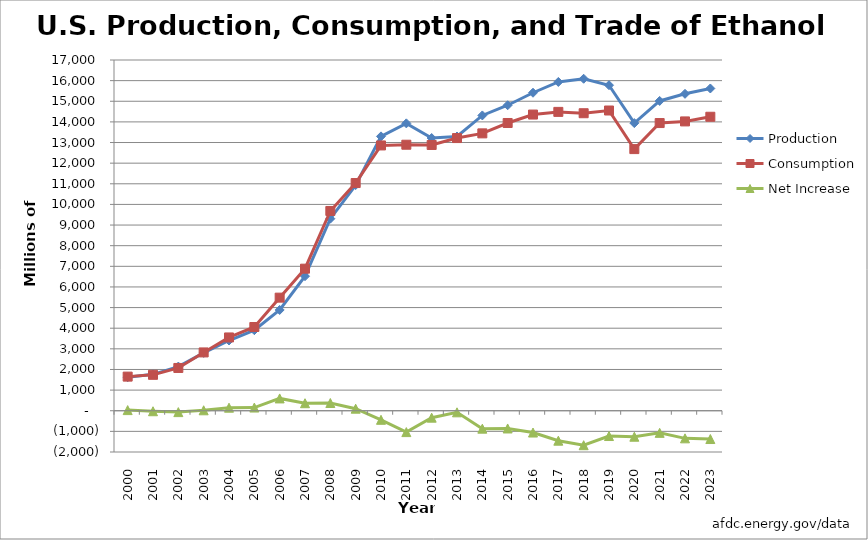
| Category | Production  | Consumption | Net Increase |
|---|---|---|---|
| 2000.0 | 1622.334 | 1653.414 | 31.08 |
| 2001.0 | 1765.176 | 1740.69 | -24.486 |
| 2002.0 | 2140.152 | 2073.12 | -67.032 |
| 2003.0 | 2804.424 | 2826.012 | 21.588 |
| 2004.0 | 3404.436 | 3552.192 | 147.756 |
| 2005.0 | 3904.362 | 4058.628 | 154.266 |
| 2006.0 | 4884.348 | 5481.21 | 596.862 |
| 2007.0 | 6521.046 | 6885.69 | 364.644 |
| 2008.0 | 9308.754 | 9683.352 | 374.598 |
| 2009.0 | 10937.808 | 11036.592 | 98.784 |
| 2010.0 | 13297.914 | 12858.497 | -439.417 |
| 2011.0 | 13929.132 | 12893.313 | -1035.819 |
| 2012.0 | 13217.988 | 12881.879 | -336.109 |
| 2013.0 | 13292.706 | 13215.619 | -77.087 |
| 2014.0 | 14313 | 13444 | -869 |
| 2015.0 | 14807 | 13947 | -860 |
| 2016.0 | 15413 | 14356 | -1057 |
| 2017.0 | 15936 | 14485 | -1451 |
| 2018.0 | 16091 | 14420 | -1671 |
| 2019.0 | 15778 | 14552 | -1226 |
| 2020.0 | 13941 | 12681 | -1260 |
| 2021.0 | 15016 | 13944 | -1072 |
| 2022.0 | 15361 | 14023 | -1338 |
| 2023.0 | 15620 | 14249 | -1371 |